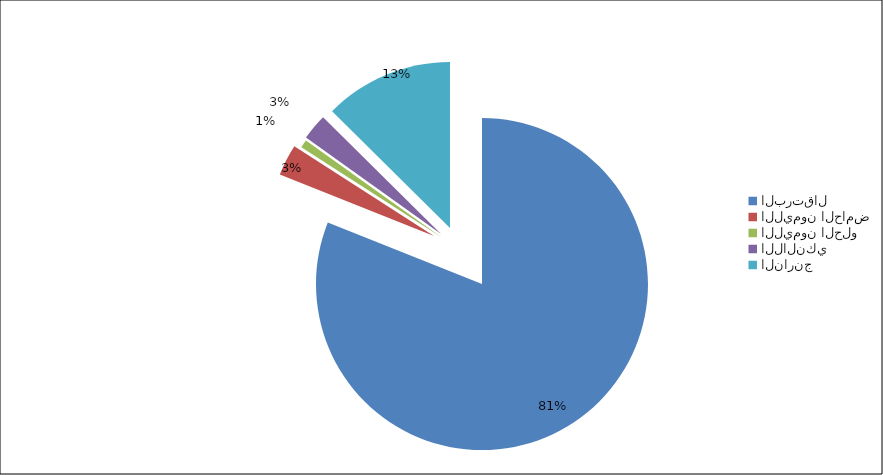
| Category | Series 0 |
|---|---|
| البرتقال | 142717 |
| الليمون الحامض | 5375 |
| الليمون الحلو | 1388 |
| اللالنكي | 4494 |
| النارنج | 22143 |